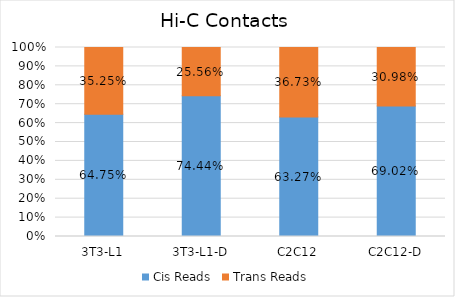
| Category | Cis Reads | Trans Reads |
|---|---|---|
| 3T3-L1 | 0.647 | 0.353 |
| 3T3-L1-D | 0.744 | 0.256 |
| C2C12 | 0.633 | 0.367 |
| C2C12-D | 0.69 | 0.31 |